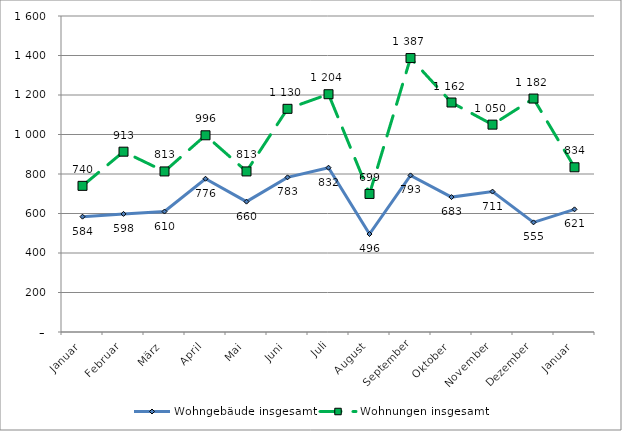
| Category | Wohngebäude insgesamt | Wohnungen insgesamt |
|---|---|---|
| Januar | 584 | 740 |
| Februar | 598 | 913 |
| März | 610 | 813 |
| April | 776 | 996 |
| Mai | 660 | 813 |
| Juni | 783 | 1130 |
| Juli | 832 | 1204 |
| August | 496 | 699 |
| September | 793 | 1387 |
| Oktober | 683 | 1162 |
| November | 711 | 1050 |
| Dezember | 555 | 1182 |
| Januar | 621 | 834 |